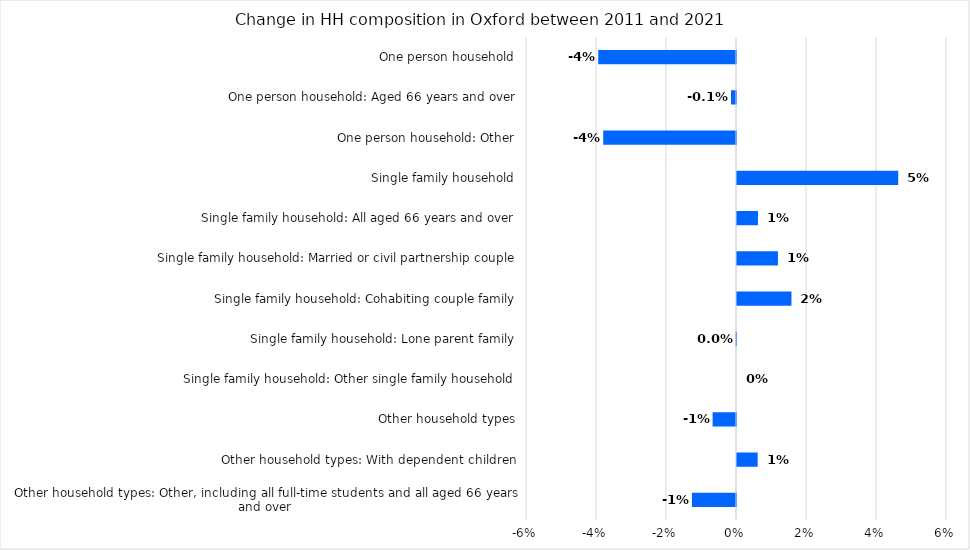
| Category | Series 0 |
|---|---|
| One person household | -0.039 |
| One person household: Aged 66 years and over | -0.001 |
| One person household: Other | -0.038 |
| Single family household | 0.046 |
| Single family household: All aged 66 years and over | 0.006 |
| Single family household: Married or civil partnership couple | 0.012 |
| Single family household: Cohabiting couple family | 0.016 |
| Single family household: Lone parent family | 0 |
| Single family household: Other single family household | 0 |
| Other household types | -0.007 |
| Other household types: With dependent children | 0.006 |
| Other household types: Other, including all full-time students and all aged 66 years and over | -0.013 |